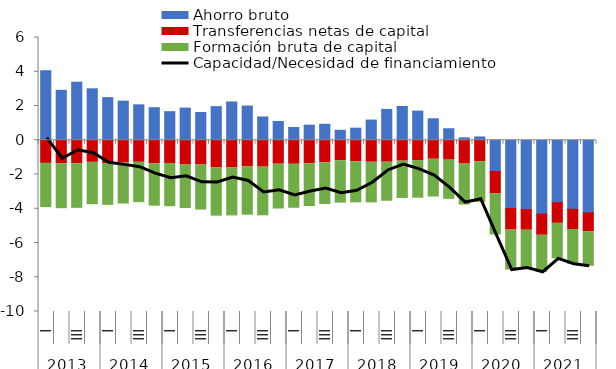
| Category | Ahorro bruto | Transferencias netas de capital | Formación bruta de capital |
|---|---|---|---|
| 0 | 4.059 | -1.351 | -2.584 |
| 1 | 2.915 | -1.374 | -2.623 |
| 2 | 3.39 | -1.373 | -2.602 |
| 3 | 3.004 | -1.291 | -2.472 |
| 4 | 2.489 | -1.361 | -2.438 |
| 5 | 2.283 | -1.327 | -2.395 |
| 6 | 2.069 | -1.286 | -2.355 |
| 7 | 1.899 | -1.37 | -2.478 |
| 8 | 1.669 | -1.356 | -2.524 |
| 9 | 1.879 | -1.446 | -2.541 |
| 10 | 1.618 | -1.447 | -2.63 |
| 11 | 1.963 | -1.616 | -2.816 |
| 12 | 2.236 | -1.616 | -2.803 |
| 13 | 1.997 | -1.546 | -2.83 |
| 14 | 1.36 | -1.569 | -2.844 |
| 15 | 1.097 | -1.399 | -2.617 |
| 16 | 0.746 | -1.403 | -2.569 |
| 17 | 0.88 | -1.37 | -2.499 |
| 18 | 0.932 | -1.318 | -2.432 |
| 19 | 0.582 | -1.193 | -2.48 |
| 20 | 0.705 | -1.264 | -2.39 |
| 21 | 1.178 | -1.285 | -2.373 |
| 22 | 1.8 | -1.283 | -2.281 |
| 23 | 1.973 | -1.219 | -2.181 |
| 24 | 1.702 | -1.187 | -2.199 |
| 25 | 1.255 | -1.111 | -2.206 |
| 26 | 0.672 | -1.163 | -2.29 |
| 27 | 0.142 | -1.39 | -2.392 |
| 28 | 0.192 | -1.248 | -2.386 |
| 29 | -1.825 | -1.313 | -2.391 |
| 30 | -3.985 | -1.258 | -2.335 |
| 31 | -4.053 | -1.202 | -2.212 |
| 32 | -4.317 | -1.233 | -2.158 |
| 33 | -3.646 | -1.205 | -2.077 |
| 34 | -4.037 | -1.176 | -2.03 |
| 35 | -4.243 | -1.093 | -2.023 |